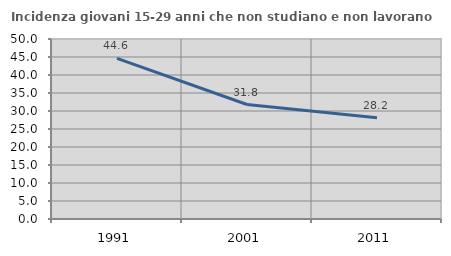
| Category | Incidenza giovani 15-29 anni che non studiano e non lavorano  |
|---|---|
| 1991.0 | 44.628 |
| 2001.0 | 31.799 |
| 2011.0 | 28.152 |